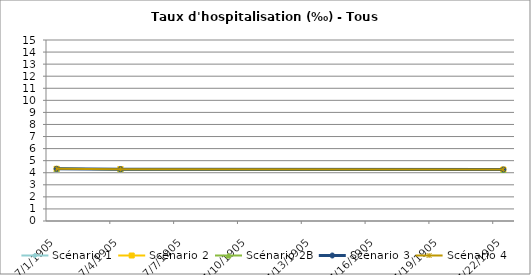
| Category | Scénario 1 | Scénario 2 | Scénario 2B | Scénario 3 | Scénario 4 |
|---|---|---|---|---|---|
| 2009.0 | 4.325 | 4.325 | 4.325 | 4.325 | 4.325 |
| 2012.0 | 4.299 | 4.299 | 4.299 | 4.299 | 4.299 |
| 2030.0 | 4.231 | 4.268 | 4.231 | 4.268 | 4.268 |